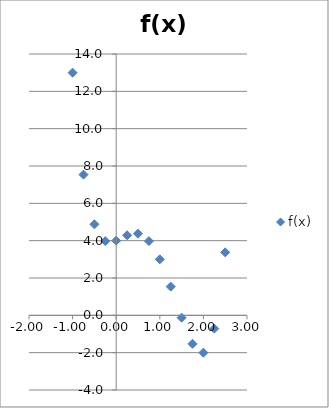
| Category | f(x) |
|---|---|
| -1.0 | 13 |
| -0.75 | 7.539 |
| -0.5 | 4.875 |
| -0.25 | 3.977 |
| 0.0 | 4 |
| 0.25 | 4.289 |
| 0.5 | 4.375 |
| 0.75 | 3.977 |
| 1.0 | 3 |
| 1.25 | 1.539 |
| 1.5 | -0.125 |
| 1.75 | -1.523 |
| 2.0 | -2 |
| 2.25 | -0.711 |
| 2.5 | 3.375 |